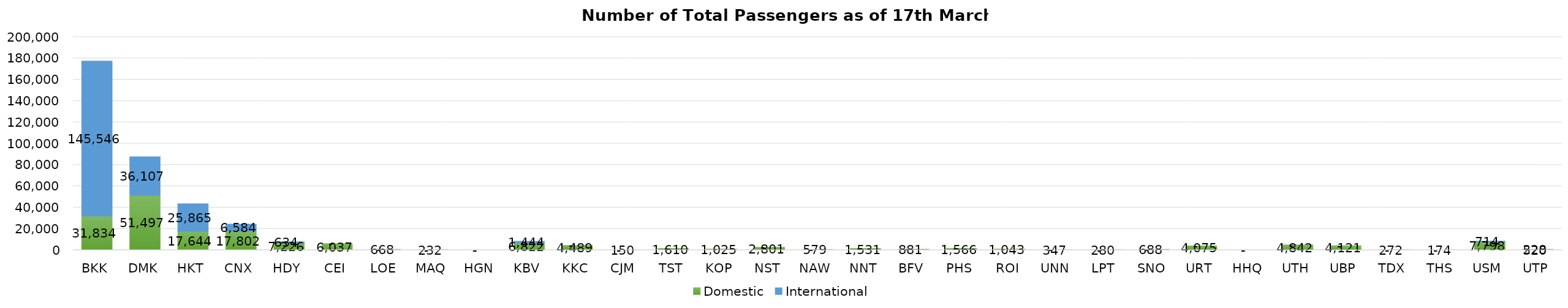
| Category | Domestic | International |
|---|---|---|
| BKK | 31834 | 145546 |
| DMK | 51497 | 36107 |
| HKT | 17644 | 25865 |
| CNX | 17802 | 6584 |
| HDY | 7226 | 634 |
| CEI | 6037 | 0 |
| LOE | 668 | 0 |
| MAQ | 232 | 0 |
| HGN | 0 | 0 |
| KBV | 6822 | 1444 |
| KKC | 4489 | 0 |
| CJM | 150 | 0 |
| TST | 1610 | 0 |
| KOP | 1025 | 0 |
| NST | 2801 | 0 |
| NAW | 579 | 0 |
| NNT | 1531 | 0 |
| BFV | 881 | 0 |
| PHS | 1566 | 0 |
| ROI | 1043 | 0 |
| UNN | 347 | 0 |
| LPT | 280 | 0 |
| SNO | 688 | 0 |
| URT | 4075 | 0 |
| HHQ | 0 | 0 |
| UTH | 4842 | 0 |
| UBP | 4121 | 0 |
| TDX | 272 | 0 |
| THS | 174 | 0 |
| USM | 7798 | 714 |
| UTP | 520 | 228 |